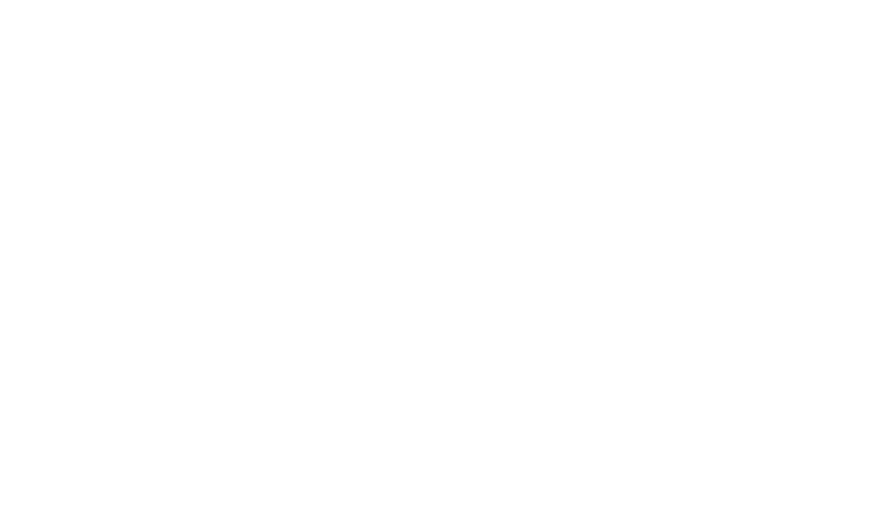
| Category | SALES FORECAST |
|---|---|
| 0.0 | 0 |
| 0.0 | 0 |
| 0.0 | 0 |
| 0.0 | 0 |
| 0.0 | 0 |
| 0.0 | 0 |
| 0.0 | 0 |
| 0.0 | 0 |
| 0.0 | 0 |